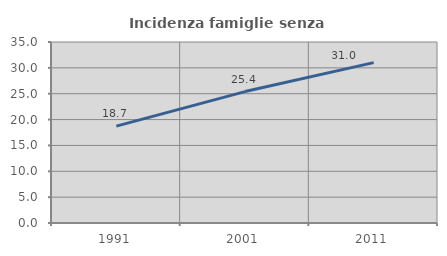
| Category | Incidenza famiglie senza nuclei |
|---|---|
| 1991.0 | 18.738 |
| 2001.0 | 25.414 |
| 2011.0 | 31.016 |